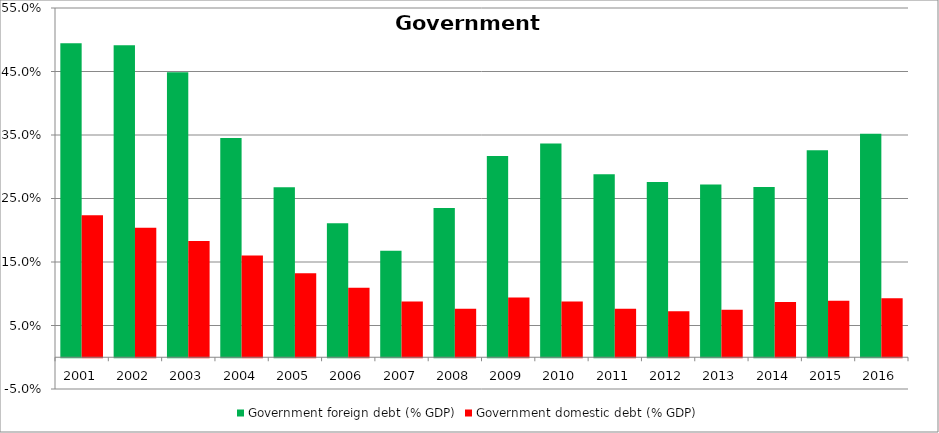
| Category | Government foreign debt (% GDP) | Government domestic debt (% GDP) |
|---|---|---|
| 2001.0 | 0.494 | 0.224 |
| 2002.0 | 0.491 | 0.204 |
| 2003.0 | 0.449 | 0.183 |
| 2004.0 | 0.345 | 0.16 |
| 2005.0 | 0.268 | 0.132 |
| 2006.0 | 0.211 | 0.11 |
| 2007.0 | 0.168 | 0.088 |
| 2008.0 | 0.235 | 0.076 |
| 2009.0 | 0.317 | 0.094 |
| 2010.0 | 0.336 | 0.088 |
| 2011.0 | 0.288 | 0.077 |
| 2012.0 | 0.276 | 0.072 |
| 2013.0 | 0.272 | 0.075 |
| 2014.0 | 0.268 | 0.087 |
| 2015.0 | 0.326 | 0.089 |
| 2016.0 | 0.352 | 0.093 |